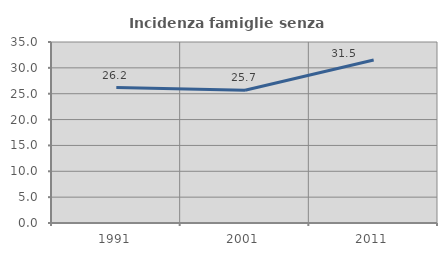
| Category | Incidenza famiglie senza nuclei |
|---|---|
| 1991.0 | 26.18 |
| 2001.0 | 25.664 |
| 2011.0 | 31.513 |